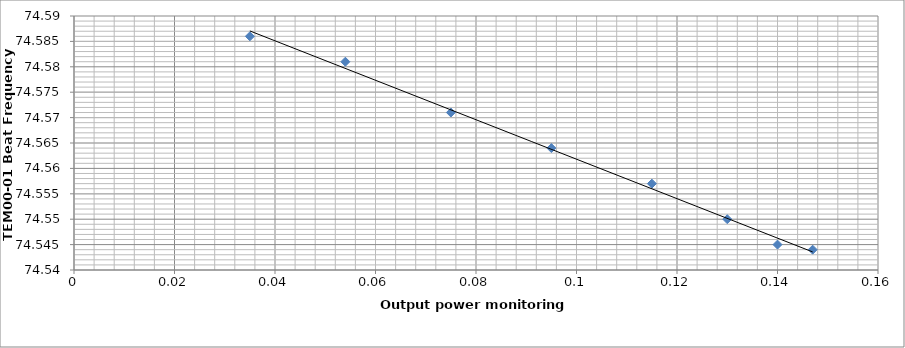
| Category | Series 0 |
|---|---|
| 0.147 | 74.544 |
| 0.14 | 74.545 |
| 0.13 | 74.55 |
| 0.115 | 74.557 |
| 0.095 | 74.564 |
| 0.075 | 74.571 |
| 0.054 | 74.581 |
| 0.035 | 74.586 |